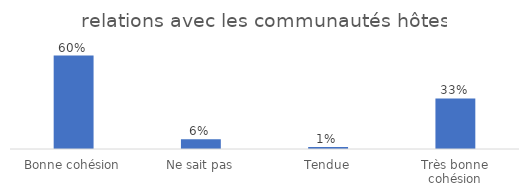
| Category | Total |
|---|---|
| Bonne cohésion | 0.6 |
| Ne sait pas | 0.062 |
| Tendue | 0.012 |
| Très bonne cohésion | 0.325 |